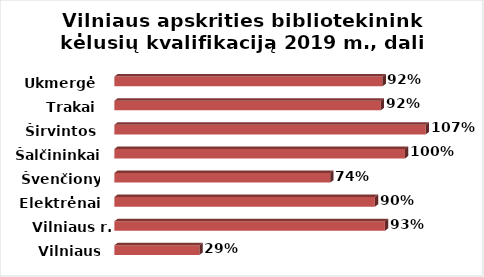
| Category | Series 0 |
|---|---|
| Vilniaus m. | 0.293 |
| Vilniaus r. | 0.931 |
| Elektrėnai | 0.897 |
| Švenčionys | 0.743 |
| Šalčininkai | 1 |
| Širvintos | 1.071 |
| Trakai | 0.917 |
| Ukmergė | 0.923 |